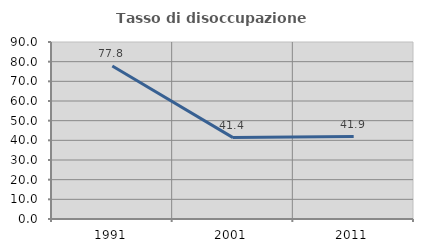
| Category | Tasso di disoccupazione giovanile  |
|---|---|
| 1991.0 | 77.778 |
| 2001.0 | 41.379 |
| 2011.0 | 41.935 |